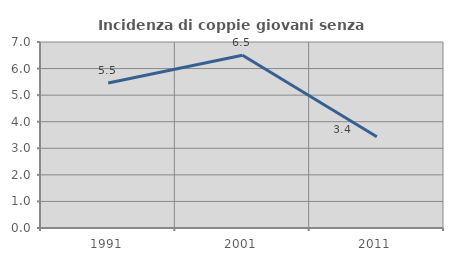
| Category | Incidenza di coppie giovani senza figli |
|---|---|
| 1991.0 | 5.457 |
| 2001.0 | 6.504 |
| 2011.0 | 3.433 |